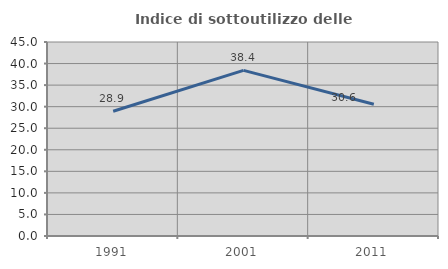
| Category | Indice di sottoutilizzo delle abitazioni  |
|---|---|
| 1991.0 | 28.926 |
| 2001.0 | 38.426 |
| 2011.0 | 30.556 |